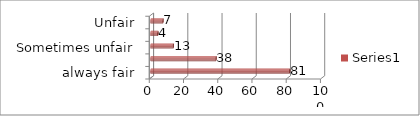
| Category | Series 0 |
|---|---|
| always fair | 81 |
| usually fair | 38 |
| Sometimes unfair | 13 |
| Usually unfair | 4 |
| Unfair | 7 |